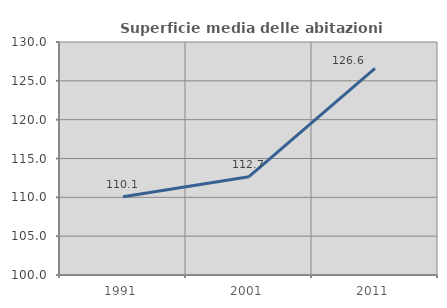
| Category | Superficie media delle abitazioni occupate |
|---|---|
| 1991.0 | 110.062 |
| 2001.0 | 112.661 |
| 2011.0 | 126.592 |